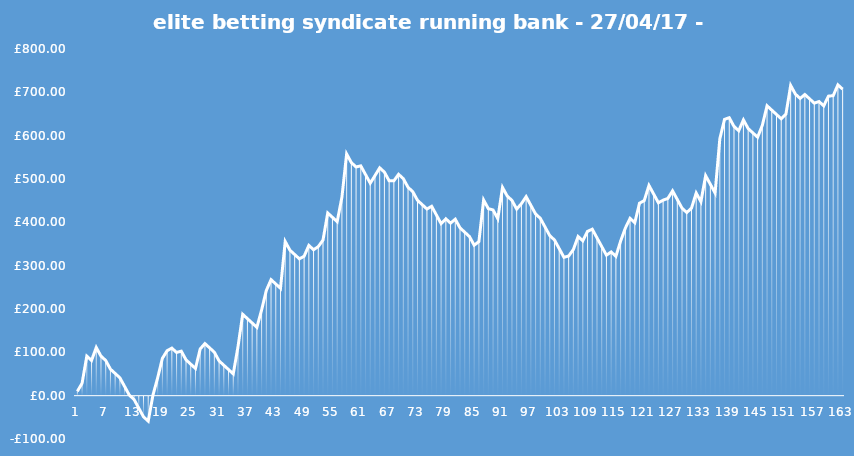
| Category | Series 0 |
|---|---|
| 0 | 10 |
| 1 | 28.75 |
| 2 | 91.25 |
| 3 | 81.25 |
| 4 | 111.25 |
| 5 | 91.25 |
| 6 | 81.25 |
| 7 | 61.25 |
| 8 | 51.25 |
| 9 | 41.25 |
| 10 | 21.25 |
| 11 | 1.25 |
| 12 | -8.75 |
| 13 | -28.75 |
| 14 | -48.75 |
| 15 | -58.75 |
| 16 | 1.25 |
| 17 | 41.25 |
| 18 | 86.25 |
| 19 | 103.75 |
| 20 | 109.75 |
| 21 | 99.75 |
| 22 | 102.75 |
| 23 | 82.75 |
| 24 | 72.75 |
| 25 | 62.75 |
| 26 | 107.75 |
| 27 | 120.25 |
| 28 | 110.25 |
| 29 | 100.25 |
| 30 | 80.25 |
| 31 | 70.25 |
| 32 | 60.25 |
| 33 | 50.25 |
| 34 | 112.75 |
| 35 | 187.75 |
| 36 | 177.75 |
| 37 | 167.75 |
| 38 | 157.75 |
| 39 | 197.75 |
| 40 | 242.75 |
| 41 | 267.75 |
| 42 | 257.75 |
| 43 | 247.75 |
| 44 | 355.75 |
| 45 | 335.75 |
| 46 | 325.75 |
| 47 | 315.75 |
| 48 | 321.75 |
| 49 | 346.75 |
| 50 | 336.75 |
| 51 | 344.05 |
| 52 | 359.05 |
| 53 | 421.55 |
| 54 | 411.55 |
| 55 | 401.55 |
| 56 | 457.8 |
| 57 | 557.8 |
| 58 | 537.8 |
| 59 | 527.8 |
| 60 | 530.3 |
| 61 | 510.3 |
| 62 | 490.3 |
| 63 | 507.8 |
| 64 | 525.8 |
| 65 | 515.8 |
| 66 | 495.8 |
| 67 | 495.8 |
| 68 | 510.8 |
| 69 | 500.8 |
| 70 | 480.8 |
| 71 | 470.8 |
| 72 | 450.8 |
| 73 | 440.8 |
| 74 | 430.8 |
| 75 | 437.05 |
| 76 | 417.05 |
| 77 | 397.05 |
| 78 | 408.15 |
| 79 | 398.15 |
| 80 | 407.25 |
| 81 | 387.25 |
| 82 | 377.25 |
| 83 | 367.25 |
| 84 | 347.25 |
| 85 | 355.55 |
| 86 | 451.55 |
| 87 | 431.55 |
| 88 | 428.55 |
| 89 | 408.55 |
| 90 | 480.55 |
| 91 | 460.55 |
| 92 | 450.55 |
| 93 | 430.55 |
| 94 | 443.05 |
| 95 | 459.3 |
| 96 | 439.3 |
| 97 | 419.3 |
| 98 | 409.3 |
| 99 | 389.3 |
| 100 | 369.3 |
| 101 | 359.3 |
| 102 | 339.3 |
| 103 | 319.3 |
| 104 | 322.3 |
| 105 | 337.3 |
| 106 | 367.3 |
| 107 | 357.3 |
| 108 | 379.175 |
| 109 | 384.175 |
| 110 | 364.175 |
| 111 | 344.175 |
| 112 | 324.175 |
| 113 | 331.675 |
| 114 | 321.675 |
| 115 | 356.675 |
| 116 | 386.675 |
| 117 | 409.175 |
| 118 | 399.175 |
| 119 | 444.175 |
| 120 | 450.175 |
| 121 | 485.175 |
| 122 | 465.175 |
| 123 | 445.175 |
| 124 | 451.175 |
| 125 | 455.175 |
| 126 | 472.675 |
| 127 | 452.675 |
| 128 | 432.675 |
| 129 | 422.675 |
| 130 | 432.675 |
| 131 | 467.675 |
| 132 | 447.675 |
| 133 | 507.675 |
| 134 | 487.675 |
| 135 | 467.675 |
| 136 | 592.675 |
| 137 | 637.675 |
| 138 | 641.425 |
| 139 | 621.425 |
| 140 | 611.425 |
| 141 | 636.425 |
| 142 | 616.425 |
| 143 | 606.425 |
| 144 | 596.425 |
| 145 | 623.925 |
| 146 | 668.925 |
| 147 | 658.925 |
| 148 | 648.925 |
| 149 | 638.925 |
| 150 | 649.925 |
| 151 | 715.925 |
| 152 | 695.925 |
| 153 | 685.925 |
| 154 | 695.025 |
| 155 | 685.025 |
| 156 | 675.025 |
| 157 | 678.775 |
| 158 | 668.775 |
| 159 | 691.275 |
| 160 | 692.275 |
| 161 | 717.275 |
| 162 | 707.275 |